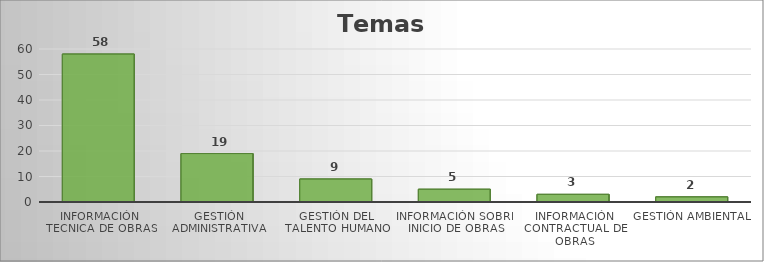
| Category | Series 0 |
|---|---|
| INFORMACIÓN TECNICA DE OBRAS | 58 |
| GESTIÓN ADMINISTRATIVA | 19 |
| GESTIÓN DEL TALENTO HUMANO | 9 |
| INFORMACIÓN SOBRE INICIO DE OBRAS | 5 |
| INFORMACIÓN CONTRACTUAL DE OBRAS | 3 |
| GESTIÓN AMBIENTAL | 2 |